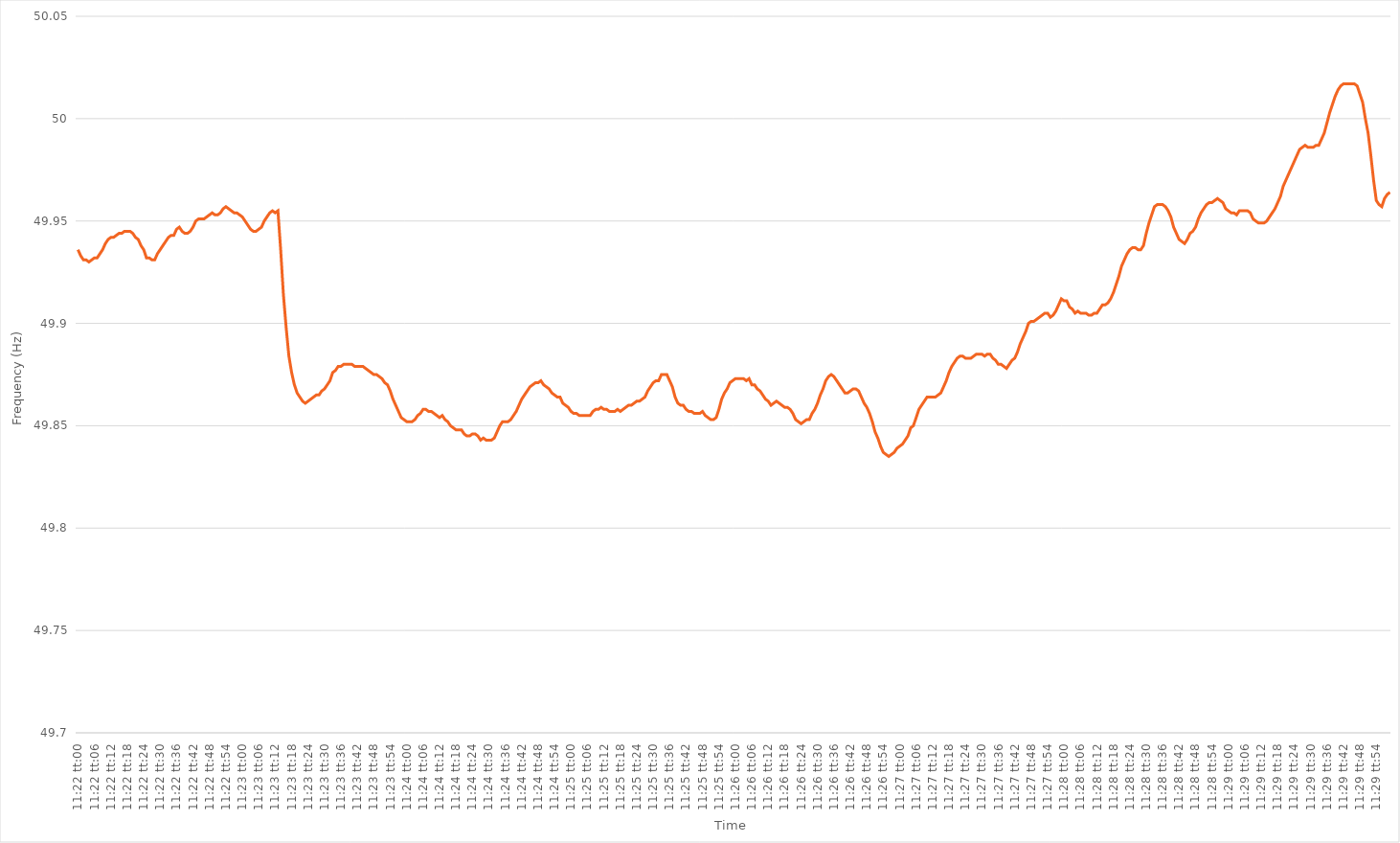
| Category | Series 0 |
|---|---|
| 0.47361111111111115 | 49.936 |
| 0.4736226851851852 | 49.933 |
| 0.4736342592592593 | 49.931 |
| 0.4736458333333333 | 49.931 |
| 0.4736574074074074 | 49.93 |
| 0.47366898148148145 | 49.931 |
| 0.4736805555555556 | 49.932 |
| 0.47369212962962964 | 49.932 |
| 0.47370370370370374 | 49.934 |
| 0.4737152777777778 | 49.936 |
| 0.4737268518518518 | 49.939 |
| 0.4737384259259259 | 49.941 |
| 0.47374999999999995 | 49.942 |
| 0.4737615740740741 | 49.942 |
| 0.47377314814814814 | 49.943 |
| 0.47378472222222223 | 49.944 |
| 0.47379629629629627 | 49.944 |
| 0.47380787037037037 | 49.945 |
| 0.4738194444444444 | 49.945 |
| 0.47383101851851855 | 49.945 |
| 0.4738425925925926 | 49.944 |
| 0.4738541666666667 | 49.942 |
| 0.4738657407407407 | 49.941 |
| 0.4738773148148148 | 49.938 |
| 0.47388888888888886 | 49.936 |
| 0.473900462962963 | 49.932 |
| 0.47391203703703705 | 49.932 |
| 0.47392361111111114 | 49.931 |
| 0.4739351851851852 | 49.931 |
| 0.4739467592592593 | 49.934 |
| 0.4739583333333333 | 49.936 |
| 0.47396990740740735 | 49.938 |
| 0.4739814814814815 | 49.94 |
| 0.47399305555555554 | 49.942 |
| 0.47400462962962964 | 49.943 |
| 0.4740162037037037 | 49.943 |
| 0.47402777777777777 | 49.946 |
| 0.4740393518518518 | 49.947 |
| 0.47405092592592596 | 49.945 |
| 0.4740625 | 49.944 |
| 0.4740740740740741 | 49.944 |
| 0.47408564814814813 | 49.945 |
| 0.4740972222222222 | 49.947 |
| 0.47410879629629626 | 49.95 |
| 0.4741203703703704 | 49.951 |
| 0.47413194444444445 | 49.951 |
| 0.47414351851851855 | 49.951 |
| 0.4741550925925926 | 49.952 |
| 0.4741666666666667 | 49.953 |
| 0.4741782407407407 | 49.954 |
| 0.47418981481481487 | 49.953 |
| 0.4742013888888889 | 49.953 |
| 0.47421296296296295 | 49.954 |
| 0.47422453703703704 | 49.956 |
| 0.4742361111111111 | 49.957 |
| 0.4742476851851852 | 49.956 |
| 0.4742592592592592 | 49.955 |
| 0.47427083333333336 | 49.954 |
| 0.4742824074074074 | 49.954 |
| 0.4742939814814815 | 49.953 |
| 0.47430555555555554 | 49.952 |
| 0.47431712962962963 | 49.95 |
| 0.47432870370370367 | 49.948 |
| 0.4743402777777778 | 49.946 |
| 0.47435185185185186 | 49.945 |
| 0.47436342592592595 | 49.945 |
| 0.474375 | 49.946 |
| 0.4743865740740741 | 49.947 |
| 0.4743981481481481 | 49.95 |
| 0.4744097222222223 | 49.952 |
| 0.4744212962962963 | 49.954 |
| 0.47443287037037035 | 49.955 |
| 0.47444444444444445 | 49.954 |
| 0.4744560185185185 | 49.955 |
| 0.4744675925925926 | 49.936 |
| 0.4744791666666666 | 49.914 |
| 0.47449074074074077 | 49.898 |
| 0.4745023148148148 | 49.884 |
| 0.4745138888888889 | 49.876 |
| 0.47452546296296294 | 49.87 |
| 0.47453703703703703 | 49.866 |
| 0.4745486111111111 | 49.864 |
| 0.4745601851851852 | 49.862 |
| 0.47457175925925926 | 49.861 |
| 0.47458333333333336 | 49.862 |
| 0.4745949074074074 | 49.863 |
| 0.4746064814814815 | 49.864 |
| 0.47461805555555553 | 49.865 |
| 0.4746296296296297 | 49.865 |
| 0.4746412037037037 | 49.867 |
| 0.4746527777777778 | 49.868 |
| 0.47466435185185185 | 49.87 |
| 0.47467592592592595 | 49.872 |
| 0.4746875 | 49.876 |
| 0.474699074074074 | 49.877 |
| 0.4747106481481482 | 49.879 |
| 0.4747222222222222 | 49.879 |
| 0.4747337962962963 | 49.88 |
| 0.47474537037037035 | 49.88 |
| 0.47475694444444444 | 49.88 |
| 0.4747685185185185 | 49.88 |
| 0.47478009259259263 | 49.879 |
| 0.47479166666666667 | 49.879 |
| 0.47480324074074076 | 49.879 |
| 0.4748148148148148 | 49.879 |
| 0.4748263888888889 | 49.878 |
| 0.47483796296296293 | 49.877 |
| 0.4748495370370371 | 49.876 |
| 0.4748611111111111 | 49.875 |
| 0.4748726851851852 | 49.875 |
| 0.47488425925925926 | 49.874 |
| 0.47489583333333335 | 49.873 |
| 0.4749074074074074 | 49.871 |
| 0.47491898148148143 | 49.87 |
| 0.4749305555555556 | 49.867 |
| 0.4749421296296296 | 49.863 |
| 0.4749537037037037 | 49.86 |
| 0.47496527777777775 | 49.857 |
| 0.47497685185185184 | 49.854 |
| 0.4749884259259259 | 49.853 |
| 0.47500000000000003 | 49.852 |
| 0.47501157407407407 | 49.852 |
| 0.47502314814814817 | 49.852 |
| 0.4750347222222222 | 49.853 |
| 0.4750462962962963 | 49.855 |
| 0.47505787037037034 | 49.856 |
| 0.4750694444444445 | 49.858 |
| 0.4750810185185185 | 49.858 |
| 0.4750925925925926 | 49.857 |
| 0.47510416666666666 | 49.857 |
| 0.47511574074074076 | 49.856 |
| 0.4751273148148148 | 49.855 |
| 0.47513888888888883 | 49.854 |
| 0.475150462962963 | 49.855 |
| 0.475162037037037 | 49.853 |
| 0.4751736111111111 | 49.852 |
| 0.47518518518518515 | 49.85 |
| 0.47519675925925925 | 49.849 |
| 0.4752083333333333 | 49.848 |
| 0.47521990740740744 | 49.848 |
| 0.4752314814814815 | 49.848 |
| 0.47524305555555557 | 49.846 |
| 0.4752546296296296 | 49.845 |
| 0.4752662037037037 | 49.845 |
| 0.47527777777777774 | 49.846 |
| 0.4752893518518519 | 49.846 |
| 0.47530092592592593 | 49.845 |
| 0.4753125 | 49.843 |
| 0.47532407407407407 | 49.844 |
| 0.47533564814814816 | 49.843 |
| 0.4753472222222222 | 49.843 |
| 0.47535879629629635 | 49.843 |
| 0.4753703703703704 | 49.844 |
| 0.4753819444444445 | 49.847 |
| 0.4753935185185185 | 49.85 |
| 0.47540509259259256 | 49.852 |
| 0.47541666666666665 | 49.852 |
| 0.4754282407407407 | 49.852 |
| 0.47543981481481484 | 49.853 |
| 0.4754513888888889 | 49.855 |
| 0.475462962962963 | 49.857 |
| 0.475474537037037 | 49.86 |
| 0.4754861111111111 | 49.863 |
| 0.47549768518518515 | 49.865 |
| 0.4755092592592593 | 49.867 |
| 0.47552083333333334 | 49.869 |
| 0.47553240740740743 | 49.87 |
| 0.47554398148148147 | 49.871 |
| 0.47555555555555556 | 49.871 |
| 0.4755671296296296 | 49.872 |
| 0.47557870370370375 | 49.87 |
| 0.4755902777777778 | 49.869 |
| 0.4756018518518519 | 49.868 |
| 0.4756134259259259 | 49.866 |
| 0.47562499999999996 | 49.865 |
| 0.47563657407407406 | 49.864 |
| 0.4756481481481481 | 49.864 |
| 0.47565972222222225 | 49.861 |
| 0.4756712962962963 | 49.86 |
| 0.4756828703703704 | 49.859 |
| 0.4756944444444444 | 49.857 |
| 0.4757060185185185 | 49.856 |
| 0.47571759259259255 | 49.856 |
| 0.4757291666666667 | 49.855 |
| 0.47574074074074074 | 49.855 |
| 0.47575231481481484 | 49.855 |
| 0.4757638888888889 | 49.855 |
| 0.47577546296296297 | 49.855 |
| 0.475787037037037 | 49.857 |
| 0.47579861111111116 | 49.858 |
| 0.4758101851851852 | 49.858 |
| 0.4758217592592593 | 49.859 |
| 0.47583333333333333 | 49.858 |
| 0.47584490740740737 | 49.858 |
| 0.47585648148148146 | 49.857 |
| 0.4758680555555555 | 49.857 |
| 0.47587962962962965 | 49.857 |
| 0.4758912037037037 | 49.858 |
| 0.4759027777777778 | 49.857 |
| 0.4759143518518518 | 49.858 |
| 0.4759259259259259 | 49.859 |
| 0.47593749999999996 | 49.86 |
| 0.4759490740740741 | 49.86 |
| 0.47596064814814815 | 49.861 |
| 0.47597222222222224 | 49.862 |
| 0.4759837962962963 | 49.862 |
| 0.4759953703703704 | 49.863 |
| 0.4760069444444444 | 49.864 |
| 0.47601851851851856 | 49.867 |
| 0.4760300925925926 | 49.869 |
| 0.4760416666666667 | 49.871 |
| 0.47605324074074074 | 49.872 |
| 0.47606481481481483 | 49.872 |
| 0.47607638888888887 | 49.875 |
| 0.476087962962963 | 49.875 |
| 0.47609953703703706 | 49.875 |
| 0.4761111111111111 | 49.872 |
| 0.4761226851851852 | 49.869 |
| 0.47613425925925923 | 49.864 |
| 0.4761458333333333 | 49.861 |
| 0.47615740740740736 | 49.86 |
| 0.4761689814814815 | 49.86 |
| 0.47618055555555555 | 49.858 |
| 0.47619212962962965 | 49.857 |
| 0.4762037037037037 | 49.857 |
| 0.4762152777777778 | 49.856 |
| 0.4762268518518518 | 49.856 |
| 0.47623842592592597 | 49.856 |
| 0.47625 | 49.857 |
| 0.4762615740740741 | 49.855 |
| 0.47627314814814814 | 49.854 |
| 0.47628472222222223 | 49.853 |
| 0.4762962962962963 | 49.853 |
| 0.4763078703703704 | 49.854 |
| 0.47631944444444446 | 49.858 |
| 0.4763310185185185 | 49.863 |
| 0.4763425925925926 | 49.866 |
| 0.47635416666666663 | 49.868 |
| 0.47636574074074073 | 49.871 |
| 0.47637731481481477 | 49.872 |
| 0.4763888888888889 | 49.873 |
| 0.47640046296296296 | 49.873 |
| 0.47641203703703705 | 49.873 |
| 0.4764236111111111 | 49.873 |
| 0.4764351851851852 | 49.872 |
| 0.4764467592592592 | 49.873 |
| 0.4764583333333334 | 49.87 |
| 0.4764699074074074 | 49.87 |
| 0.4764814814814815 | 49.868 |
| 0.47649305555555554 | 49.867 |
| 0.47650462962962964 | 49.865 |
| 0.4765162037037037 | 49.863 |
| 0.47652777777777783 | 49.862 |
| 0.47653935185185187 | 49.86 |
| 0.47655092592592596 | 49.861 |
| 0.4765625 | 49.862 |
| 0.47657407407407404 | 49.861 |
| 0.47658564814814813 | 49.86 |
| 0.47659722222222217 | 49.859 |
| 0.4766087962962963 | 49.859 |
| 0.47662037037037036 | 49.858 |
| 0.47663194444444446 | 49.856 |
| 0.4766435185185185 | 49.853 |
| 0.4766550925925926 | 49.852 |
| 0.4766666666666666 | 49.851 |
| 0.4766782407407408 | 49.852 |
| 0.4766898148148148 | 49.853 |
| 0.4767013888888889 | 49.853 |
| 0.47671296296296295 | 49.856 |
| 0.47672453703703704 | 49.858 |
| 0.4767361111111111 | 49.861 |
| 0.47674768518518523 | 49.865 |
| 0.47675925925925927 | 49.868 |
| 0.47677083333333337 | 49.872 |
| 0.4767824074074074 | 49.874 |
| 0.4767939814814815 | 49.875 |
| 0.47680555555555554 | 49.874 |
| 0.4768171296296296 | 49.872 |
| 0.4768287037037037 | 49.87 |
| 0.47684027777777777 | 49.868 |
| 0.47685185185185186 | 49.866 |
| 0.4768634259259259 | 49.866 |
| 0.476875 | 49.867 |
| 0.47688657407407403 | 49.868 |
| 0.4768981481481482 | 49.868 |
| 0.4769097222222222 | 49.867 |
| 0.4769212962962963 | 49.864 |
| 0.47693287037037035 | 49.861 |
| 0.47694444444444445 | 49.859 |
| 0.4769560185185185 | 49.856 |
| 0.47696759259259264 | 49.852 |
| 0.4769791666666667 | 49.847 |
| 0.47699074074074077 | 49.844 |
| 0.4770023148148148 | 49.84 |
| 0.4770138888888889 | 49.837 |
| 0.47702546296296294 | 49.836 |
| 0.477037037037037 | 49.835 |
| 0.47704861111111113 | 49.836 |
| 0.47706018518518517 | 49.837 |
| 0.47707175925925926 | 49.839 |
| 0.4770833333333333 | 49.84 |
| 0.4770949074074074 | 49.841 |
| 0.47710648148148144 | 49.843 |
| 0.4771180555555556 | 49.845 |
| 0.4771296296296296 | 49.849 |
| 0.4771412037037037 | 49.85 |
| 0.47715277777777776 | 49.854 |
| 0.47716435185185185 | 49.858 |
| 0.4771759259259259 | 49.86 |
| 0.47718750000000004 | 49.862 |
| 0.4771990740740741 | 49.864 |
| 0.4772106481481482 | 49.864 |
| 0.4772222222222222 | 49.864 |
| 0.4772337962962963 | 49.864 |
| 0.47724537037037035 | 49.865 |
| 0.4772569444444445 | 49.866 |
| 0.47726851851851854 | 49.869 |
| 0.47728009259259263 | 49.872 |
| 0.47729166666666667 | 49.876 |
| 0.4773032407407407 | 49.879 |
| 0.4773148148148148 | 49.881 |
| 0.47732638888888884 | 49.883 |
| 0.477337962962963 | 49.884 |
| 0.47734953703703703 | 49.884 |
| 0.4773611111111111 | 49.883 |
| 0.47737268518518516 | 49.883 |
| 0.47738425925925926 | 49.883 |
| 0.4773958333333333 | 49.884 |
| 0.47740740740740745 | 49.885 |
| 0.4774189814814815 | 49.885 |
| 0.4774305555555556 | 49.885 |
| 0.4774421296296296 | 49.884 |
| 0.4774537037037037 | 49.885 |
| 0.47746527777777775 | 49.885 |
| 0.4774768518518519 | 49.883 |
| 0.47748842592592594 | 49.882 |
| 0.47750000000000004 | 49.88 |
| 0.4775115740740741 | 49.88 |
| 0.4775231481481481 | 49.879 |
| 0.4775347222222222 | 49.878 |
| 0.47754629629629625 | 49.88 |
| 0.4775578703703704 | 49.882 |
| 0.47756944444444444 | 49.883 |
| 0.47758101851851853 | 49.886 |
| 0.47759259259259257 | 49.89 |
| 0.47760416666666666 | 49.893 |
| 0.4776157407407407 | 49.896 |
| 0.47762731481481485 | 49.9 |
| 0.4776388888888889 | 49.901 |
| 0.477650462962963 | 49.901 |
| 0.477662037037037 | 49.902 |
| 0.4776736111111111 | 49.903 |
| 0.47768518518518516 | 49.904 |
| 0.4776967592592593 | 49.905 |
| 0.47770833333333335 | 49.905 |
| 0.47771990740740744 | 49.903 |
| 0.4777314814814815 | 49.904 |
| 0.4777430555555555 | 49.906 |
| 0.4777546296296296 | 49.909 |
| 0.47776620370370365 | 49.912 |
| 0.4777777777777778 | 49.911 |
| 0.47778935185185184 | 49.911 |
| 0.47780092592592593 | 49.908 |
| 0.4778125 | 49.907 |
| 0.47782407407407407 | 49.905 |
| 0.4778356481481481 | 49.906 |
| 0.47784722222222226 | 49.905 |
| 0.4778587962962963 | 49.905 |
| 0.4778703703703704 | 49.905 |
| 0.47788194444444443 | 49.904 |
| 0.4778935185185185 | 49.904 |
| 0.47790509259259256 | 49.905 |
| 0.4779166666666667 | 49.905 |
| 0.47792824074074075 | 49.907 |
| 0.47793981481481485 | 49.909 |
| 0.4779513888888889 | 49.909 |
| 0.477962962962963 | 49.91 |
| 0.477974537037037 | 49.912 |
| 0.47798611111111117 | 49.915 |
| 0.4779976851851852 | 49.919 |
| 0.47800925925925924 | 49.923 |
| 0.47802083333333334 | 49.928 |
| 0.4780324074074074 | 49.931 |
| 0.4780439814814815 | 49.934 |
| 0.4780555555555555 | 49.936 |
| 0.47806712962962966 | 49.937 |
| 0.4780787037037037 | 49.937 |
| 0.4780902777777778 | 49.936 |
| 0.47810185185185183 | 49.936 |
| 0.47811342592592593 | 49.938 |
| 0.47812499999999997 | 49.944 |
| 0.4781365740740741 | 49.949 |
| 0.47814814814814816 | 49.953 |
| 0.47815972222222225 | 49.957 |
| 0.4781712962962963 | 49.958 |
| 0.4781828703703704 | 49.958 |
| 0.4781944444444444 | 49.958 |
| 0.47820601851851857 | 49.957 |
| 0.4782175925925926 | 49.955 |
| 0.47822916666666665 | 49.952 |
| 0.47824074074074074 | 49.947 |
| 0.4782523148148148 | 49.944 |
| 0.4782638888888889 | 49.941 |
| 0.4782754629629629 | 49.94 |
| 0.47828703703703707 | 49.939 |
| 0.4782986111111111 | 49.941 |
| 0.4783101851851852 | 49.944 |
| 0.47832175925925924 | 49.945 |
| 0.47833333333333333 | 49.947 |
| 0.47834490740740737 | 49.951 |
| 0.4783564814814815 | 49.954 |
| 0.47836805555555556 | 49.956 |
| 0.47837962962962965 | 49.958 |
| 0.4783912037037037 | 49.959 |
| 0.4784027777777778 | 49.959 |
| 0.4784143518518518 | 49.96 |
| 0.478425925925926 | 49.961 |
| 0.4784375 | 49.96 |
| 0.47844907407407405 | 49.959 |
| 0.47846064814814815 | 49.956 |
| 0.4784722222222222 | 49.955 |
| 0.4784837962962963 | 49.954 |
| 0.4784953703703703 | 49.954 |
| 0.47850694444444447 | 49.953 |
| 0.4785185185185185 | 49.955 |
| 0.4785300925925926 | 49.955 |
| 0.47854166666666664 | 49.955 |
| 0.47855324074074074 | 49.955 |
| 0.4785648148148148 | 49.954 |
| 0.4785763888888889 | 49.951 |
| 0.47858796296296297 | 49.95 |
| 0.47859953703703706 | 49.949 |
| 0.4786111111111111 | 49.949 |
| 0.4786226851851852 | 49.949 |
| 0.47863425925925923 | 49.95 |
| 0.4786458333333334 | 49.952 |
| 0.4786574074074074 | 49.954 |
| 0.4786689814814815 | 49.956 |
| 0.47868055555555555 | 49.959 |
| 0.47869212962962965 | 49.962 |
| 0.4787037037037037 | 49.967 |
| 0.4787152777777777 | 49.97 |
| 0.4787268518518519 | 49.973 |
| 0.4787384259259259 | 49.976 |
| 0.47875 | 49.979 |
| 0.47876157407407405 | 49.982 |
| 0.47877314814814814 | 49.985 |
| 0.4787847222222222 | 49.986 |
| 0.47879629629629633 | 49.987 |
| 0.47880787037037037 | 49.986 |
| 0.47881944444444446 | 49.986 |
| 0.4788310185185185 | 49.986 |
| 0.4788425925925926 | 49.987 |
| 0.47885416666666664 | 49.987 |
| 0.4788657407407408 | 49.99 |
| 0.4788773148148148 | 49.993 |
| 0.4788888888888889 | 49.998 |
| 0.47890046296296296 | 50.003 |
| 0.47891203703703705 | 50.007 |
| 0.4789236111111111 | 50.011 |
| 0.47893518518518513 | 50.014 |
| 0.4789467592592593 | 50.016 |
| 0.4789583333333333 | 50.017 |
| 0.4789699074074074 | 50.017 |
| 0.47898148148148145 | 50.017 |
| 0.47899305555555555 | 50.017 |
| 0.4790046296296296 | 50.017 |
| 0.47901620370370374 | 50.016 |
| 0.4790277777777778 | 50.012 |
| 0.47903935185185187 | 50.008 |
| 0.4790509259259259 | 50 |
| 0.4790625 | 49.993 |
| 0.47907407407407404 | 49.982 |
| 0.4790856481481482 | 49.97 |
| 0.47909722222222223 | 49.96 |
| 0.4791087962962963 | 49.958 |
| 0.47912037037037036 | 49.957 |
| 0.47913194444444446 | 49.961 |
| 0.4791435185185185 | 49.963 |
| 0.47915509259259265 | 49.964 |